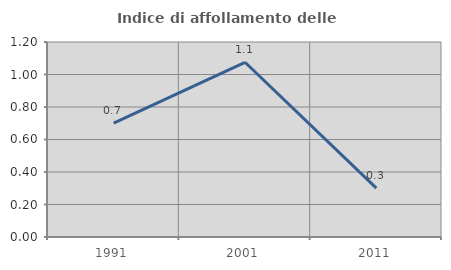
| Category | Indice di affollamento delle abitazioni  |
|---|---|
| 1991.0 | 0.701 |
| 2001.0 | 1.075 |
| 2011.0 | 0.301 |